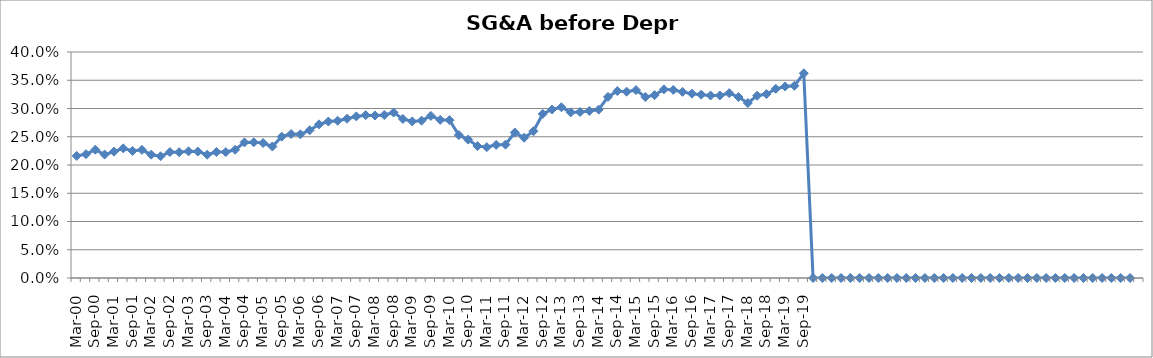
| Category | SG&A (before depr.) % |
|---|---|
| Mar-00 | 0.216 |
| Jun-00 | 0.219 |
| Sep-00 | 0.227 |
| Dec-00 | 0.218 |
| Mar-01 | 0.224 |
| Jun-01 | 0.23 |
| Sep-01 | 0.225 |
| Dec-01 | 0.227 |
| Mar-02 | 0.218 |
| Jun-02 | 0.215 |
| Sep-02 | 0.223 |
| Dec-02 | 0.223 |
| Mar-03 | 0.224 |
| Jun-03 | 0.224 |
| Sep-03 | 0.218 |
| Dec-03 | 0.223 |
| Mar-04 | 0.223 |
| Jun-04 | 0.227 |
| Sep-04 | 0.24 |
| Dec-04 | 0.24 |
| Mar-05 | 0.239 |
| Jun-05 | 0.233 |
| Sep-05 | 0.25 |
| Dec-05 | 0.255 |
| Mar-06 | 0.254 |
| Jun-06 | 0.261 |
| Sep-06 | 0.272 |
| Dec-06 | 0.277 |
| Mar-07 | 0.278 |
| Jun-07 | 0.282 |
| Sep-07 | 0.286 |
| Dec-07 | 0.288 |
| Mar-08 | 0.288 |
| Jun-08 | 0.288 |
| Sep-08 | 0.293 |
| Dec-08 | 0.281 |
| Mar-09 | 0.277 |
| Jun-09 | 0.279 |
| Sep-09 | 0.287 |
| Dec-09 | 0.28 |
| Mar-10 | 0.279 |
| Jun-10 | 0.253 |
| Sep-10 | 0.245 |
| Dec-10 | 0.233 |
| Mar-11 | 0.232 |
| Jun-11 | 0.236 |
| Sep-11 | 0.236 |
| Dec-11 | 0.257 |
| Mar-12 | 0.248 |
| Jun-12 | 0.26 |
| Sep-12 | 0.29 |
| Dec-12 | 0.298 |
| Mar-13 | 0.302 |
| Jun-13 | 0.293 |
| Sep-13 | 0.294 |
| Dec-13 | 0.296 |
| Mar-14 | 0.298 |
| Jun-14 | 0.32 |
| Sep-14 | 0.331 |
| Dec-14 | 0.33 |
| Mar-15 | 0.333 |
| Jun-15 | 0.32 |
| Sep-15 | 0.324 |
| Dec-15 | 0.334 |
| Mar-16 | 0.333 |
| Jun-16 | 0.329 |
| Sep-16 | 0.326 |
| Dec-16 | 0.325 |
| Mar-17 | 0.323 |
| Jun-17 | 0.323 |
| Sep-17 | 0.327 |
| Dec-17 | 0.32 |
| Mar-18 | 0.31 |
| Jun-18 | 0.323 |
| Sep-18 | 0.326 |
| Dec-18 | 0.335 |
| Mar-19 | 0.339 |
| Jun-19 | 0.34 |
| Sep-19 | 0.362 |